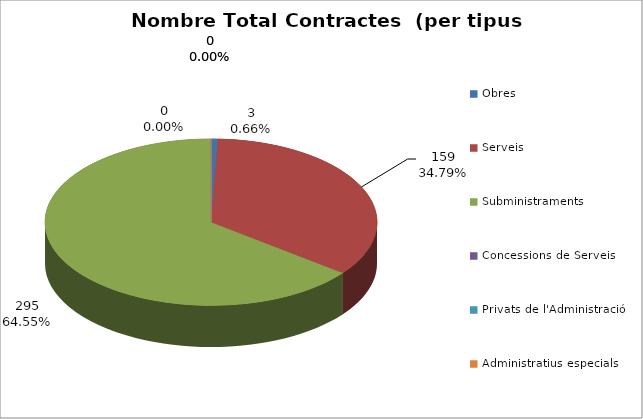
| Category | Nombre Total Contractes |
|---|---|
| Obres | 3 |
| Serveis | 159 |
| Subministraments | 295 |
| Concessions de Serveis | 0 |
| Privats de l'Administració | 0 |
| Administratius especials | 0 |